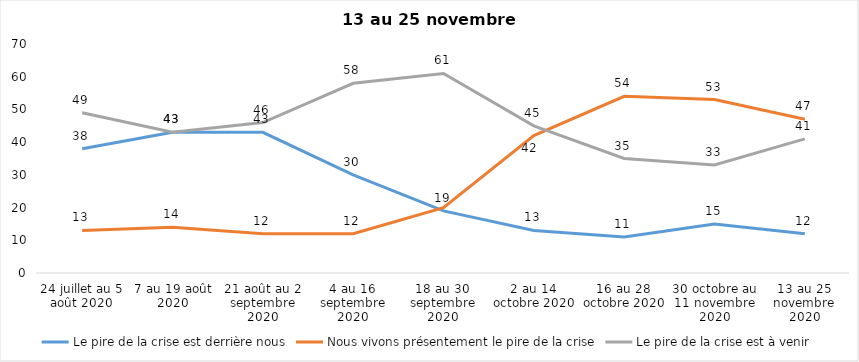
| Category | Le pire de la crise est derrière nous | Nous vivons présentement le pire de la crise | Le pire de la crise est à venir |
|---|---|---|---|
| 24 juillet au 5 août 2020 | 38 | 13 | 49 |
| 7 au 19 août 2020 | 43 | 14 | 43 |
| 21 août au 2 septembre 2020 | 43 | 12 | 46 |
| 4 au 16 septembre 2020 | 30 | 12 | 58 |
| 18 au 30 septembre 2020 | 19 | 20 | 61 |
| 2 au 14 octobre 2020 | 13 | 42 | 45 |
| 16 au 28 octobre 2020 | 11 | 54 | 35 |
| 30 octobre au 11 novembre 2020 | 15 | 53 | 33 |
| 13 au 25 novembre 2020 | 12 | 47 | 41 |